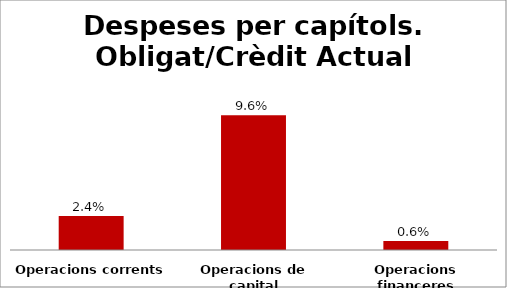
| Category | Series 0 |
|---|---|
| Operacions corrents | 0.024 |
| Operacions de capital | 0.096 |
| Operacions financeres | 0.006 |